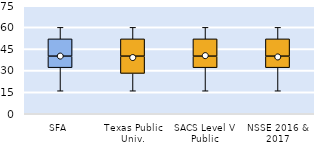
| Category | 25th | 50th | 75th |
|---|---|---|---|
| SFA | 32 | 8 | 12 |
| Texas Public Univ. | 28 | 12 | 12 |
| SACS Level V Public | 32 | 8 | 12 |
| NSSE 2016 & 2017 | 32 | 8 | 12 |